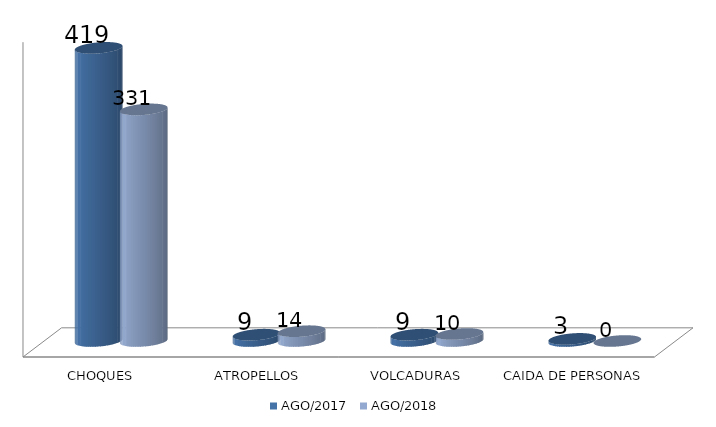
| Category | AGO/2017 | AGO/2018 |
|---|---|---|
| CHOQUES | 419 | 331 |
| ATROPELLOS | 9 | 14 |
| VOLCADURAS | 9 | 10 |
| CAIDA DE PERSONAS | 3 | 0 |